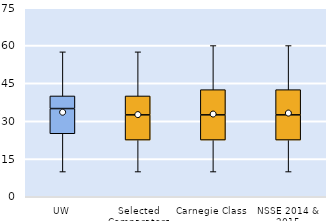
| Category | 25th | 50th | 75th |
|---|---|---|---|
| UW | 25 | 10 | 5 |
| Selected Comparators | 22.5 | 10 | 7.5 |
| Carnegie Class | 22.5 | 10 | 10 |
| NSSE 2014 & 2015 | 22.5 | 10 | 10 |